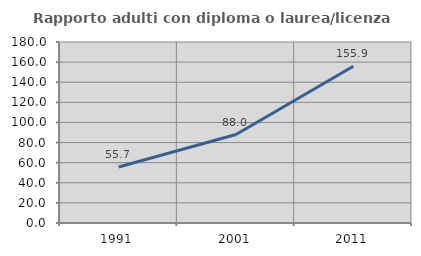
| Category | Rapporto adulti con diploma o laurea/licenza media  |
|---|---|
| 1991.0 | 55.708 |
| 2001.0 | 87.983 |
| 2011.0 | 155.932 |